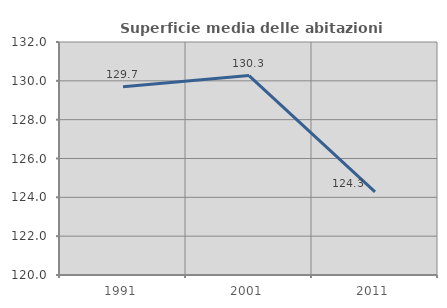
| Category | Superficie media delle abitazioni occupate |
|---|---|
| 1991.0 | 129.691 |
| 2001.0 | 130.272 |
| 2011.0 | 124.286 |